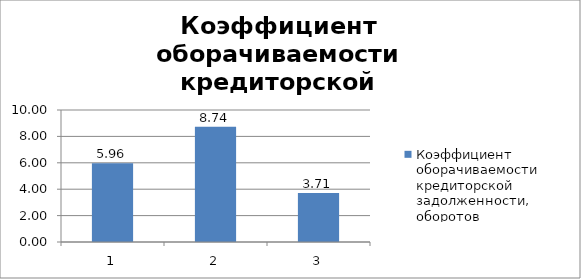
| Category | Коэффициент оборачиваемости кредиторской задолженности, оборотов |
|---|---|
| 0 | 5.964 |
| 1 | 8.738 |
| 2 | 3.712 |